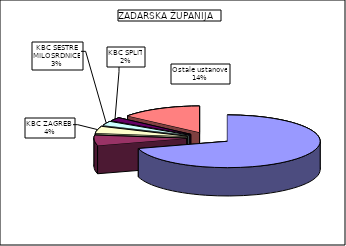
| Category | Series 0 |
|---|---|
| OB ZADAR | 70.576 |
| SPECIJALNA BOLNICA ZA ORTOPEDIJU, BIOGRAD NA MORU | 6.337 |
| KBC ZAGREB  | 4.225 |
| KBC SESTRE MILOSRDNICE | 2.56 |
| KBC SPLIT | 2.15 |
| Ostale ustanove | 14.152 |